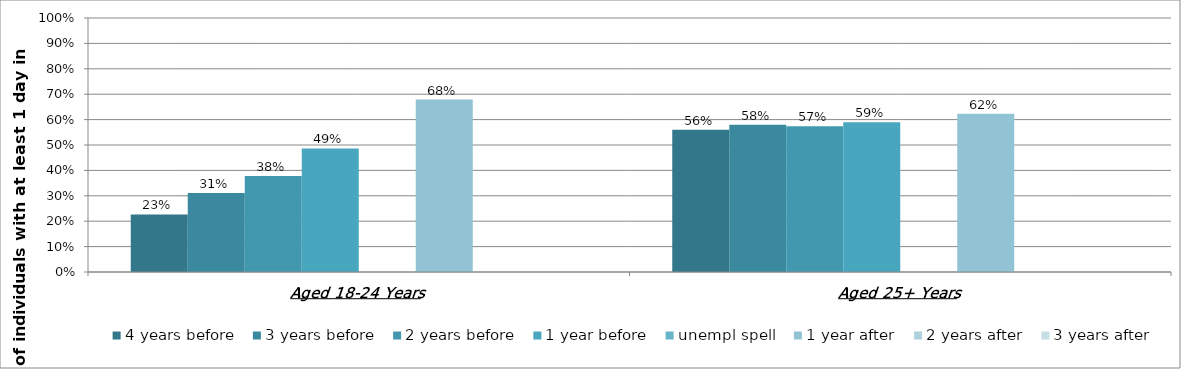
| Category | 4 years before | 3 years before | 2 years before | 1 year before | unempl spell | 1 year after | 2 years after | 3 years after |
|---|---|---|---|---|---|---|---|---|
| Aged 18-24 Years | 0.227 | 0.311 | 0.378 | 0.487 |  | 0.679 |  |  |
| Aged 25+ Years | 0.56 | 0.58 | 0.574 | 0.589 |  | 0.623 |  |  |